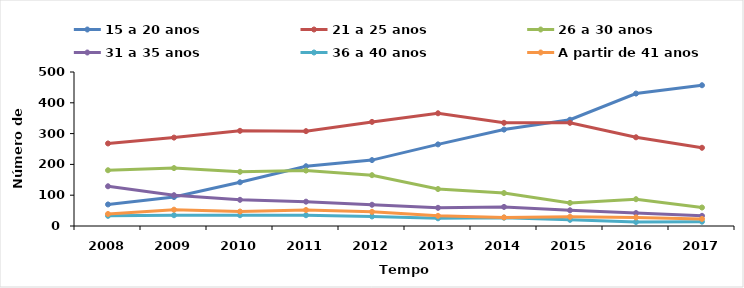
| Category | 15 a 20 anos | 21 a 25 anos | 26 a 30 anos | 31 a 35 anos | 36 a 40 anos | A partir de 41 anos |
|---|---|---|---|---|---|---|
| 2008.0 | 70 | 268 | 181 | 129 | 33 | 39 |
| 2009.0 | 94 | 287 | 188 | 100 | 35 | 53 |
| 2010.0 | 142 | 309 | 176 | 85 | 35 | 47 |
| 2011.0 | 194 | 308 | 180 | 79 | 35 | 52 |
| 2012.0 | 214 | 338 | 165 | 69 | 31 | 46 |
| 2013.0 | 265 | 366 | 120 | 59 | 25 | 33 |
| 2014.0 | 313 | 335 | 107 | 62 | 27 | 28 |
| 2015.0 | 345 | 335 | 75 | 51 | 20 | 30 |
| 2016.0 | 430 | 288 | 87 | 42 | 13 | 28 |
| 2017.0 | 457 | 254 | 60 | 33 | 14 | 23 |